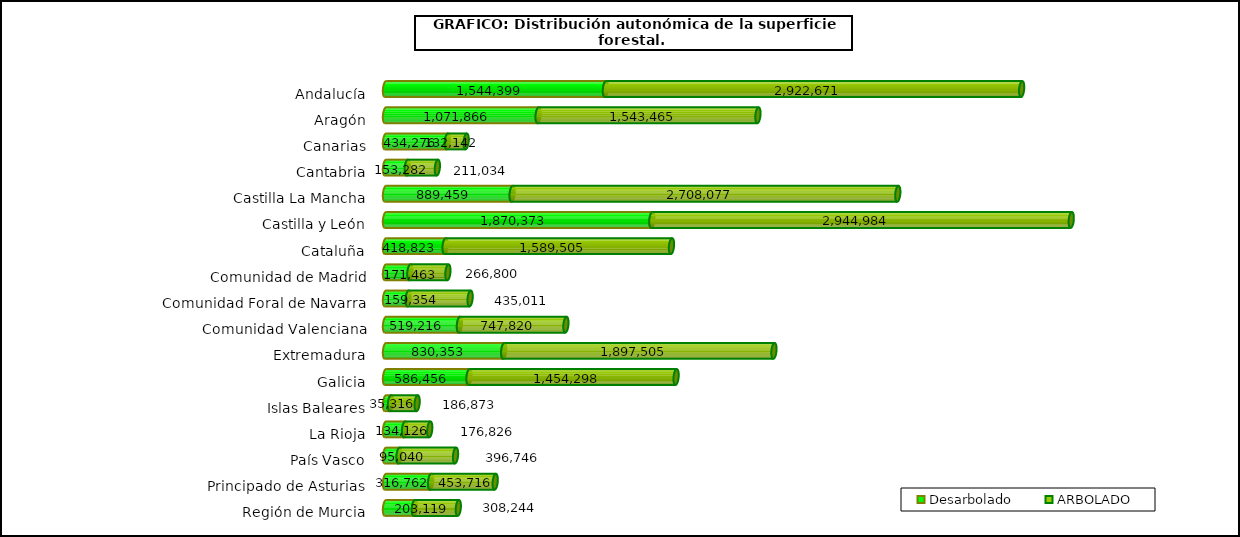
| Category | Desarbolado | ARBOLADO |
|---|---|---|
| Andalucía | 1544399.441 | 2922670.688 |
| Aragón | 1071866.444 | 1543465.178 |
| Canarias | 434275.866 | 132141.953 |
| Cantabria | 153282.495 | 211034.493 |
| Castilla La Mancha | 889459.195 | 2708077.312 |
| Castilla y León | 1870372.822 | 2944983.924 |
| Cataluña | 418823.203 | 1589505.325 |
| Comunidad de Madrid | 171462.672 | 266799.661 |
| Comunidad Foral de Navarra | 159354.476 | 435011.061 |
| Comunidad Valenciana | 519215.632 | 747820.478 |
| Extremadura | 830353.036 | 1897505.194 |
| Galicia | 586456.281 | 1454297.761 |
| Islas Baleares | 35315.826 | 186872.539 |
| La Rioja | 134126.249 | 176826.022 |
| País Vasco | 95040.215 | 396745.855 |
| Principado de Asturias | 316762.429 | 453716.341 |
| Región de Murcia | 203119.381 | 308244.333 |